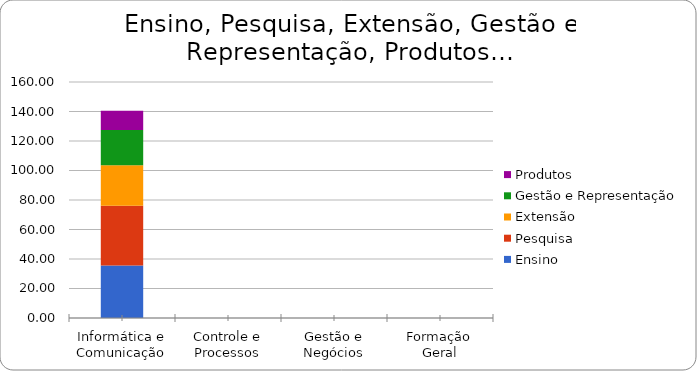
| Category | Ensino | Pesquisa | Extensão | Gestão e Representação | Produtos |
|---|---|---|---|---|---|
| Informática e Comunicação | 35.665 | 40.5 | 27.417 | 23.917 | 13 |
| Controle e Processos | 0 | 0 | 0 | 0 | 0 |
| Gestão e Negócios | 0 | 0 | 0 | 0 | 0 |
| Formação Geral | 0 | 0 | 0 | 0 | 0 |